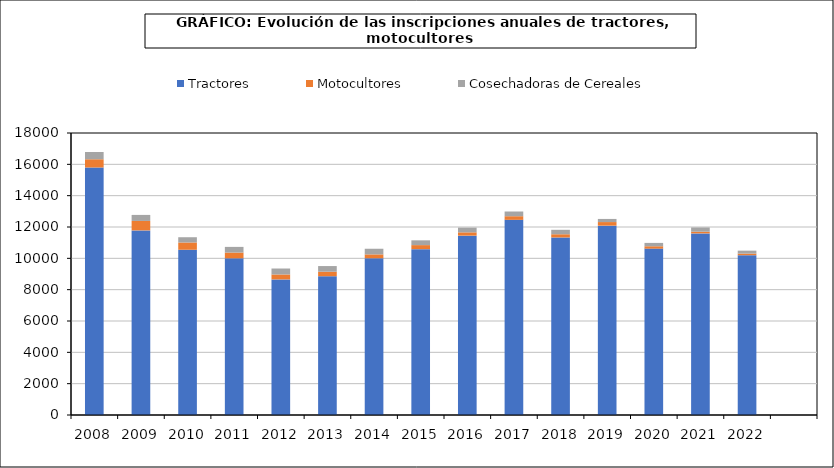
| Category | Tractores | Motocultores | Cosechadoras de Cereales |
|---|---|---|---|
| 2008.0 | 15799 | 525 | 463 |
| 2009.0 | 11784 | 603 | 384 |
| 2010.0 | 10548 | 463 | 336 |
| 2011.0 | 10002 | 366 | 362 |
| 2012.0 | 8655 | 315 | 380 |
| 2013.0 | 8859 | 287 | 361 |
| 2014.0 | 10004 | 248 | 360 |
| 2015.0 | 10587 | 257 | 305 |
| 2016.0 | 11449 | 209 | 302 |
| 2017.0 | 12457 | 231 | 301 |
| 2018.0 | 11333 | 204 | 284 |
| 2019.0 | 12087 | 228 | 200 |
| 2020.0 | 10620 | 150 | 215 |
| 2021.0 | 11593 | 105 | 273 |
| 2022.0 | 10200 | 101 | 190 |